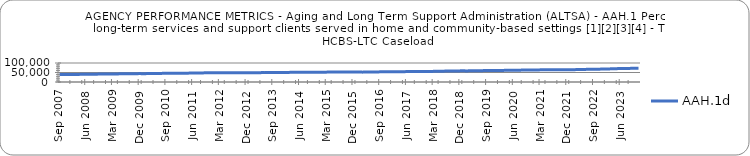
| Category | AAH.1d |
|---|---|
| 0.78378 | 38905 |
| 0.78567 | 39202 |
| 0.78719 | 39279 |
| 0.7887 | 39374 |
| 0.79022 | 39554 |
| 0.79129 | 39686 |
| 0.79193 | 40013 |
| 0.79455 | 40152 |
| 0.79439 | 40320 |
| 0.79457 | 40334 |
| 0.79632 | 40580 |
| 0.79721 | 40848 |
| 0.79865 | 41060 |
| 0.79917 | 41489 |
| 0.79965 | 41567 |
| 0.79991 | 41697 |
| 0.80036 | 41696 |
| 0.80119 | 41884 |
| 0.80135 | 42312 |
| 0.80196 | 42527 |
| 0.80282 | 42767 |
| 0.80375 | 42926 |
| 0.80441 | 43175 |
| 0.80454 | 43436 |
| 0.80574 | 43646 |
| 0.80717 | 43920 |
| 0.80907 | 43999 |
| 0.80996 | 44103 |
| 0.81048 | 43999 |
| 0.81132 | 43990 |
| 0.81235 | 44361 |
| 0.81422 | 44488 |
| 0.81521 | 44777 |
| 0.81511 | 45038 |
| 0.816 | 45290 |
| 0.81562 | 45478 |
| 0.8177 | 45665 |
| 0.81902 | 45926 |
| 0.81999 | 45857 |
| 0.8202 | 45906 |
| 0.82092 | 45936 |
| 0.82336 | 45761 |
| 0.82379 | 46341 |
| 0.82545 | 46554 |
| 0.82578 | 46824 |
| 0.82632 | 46897 |
| 0.82543 | 47022 |
| 0.82484 | 47576 |
| 0.82636 | 47698 |
| 0.82733 | 48230 |
| 0.82838 | 48206 |
| 0.82888 | 48496 |
| 0.82809 | 48030 |
| 0.82917 | 48009 |
| 0.82866 | 48387 |
| 0.82858 | 48517 |
| 0.82802 | 48705 |
| 0.82938 | 48796 |
| 0.83046 | 48743 |
| 0.83086 | 49003 |
| 0.83171 | 48806 |
| 0.83162 | 49080 |
| 0.83156 | 48933 |
| 0.8309 | 48965 |
| 0.83222 | 49088 |
| 0.83276 | 48876 |
| 0.83338 | 49037 |
| 0.83336 | 49130 |
| 0.83239 | 49349 |
| 0.83251 | 49324 |
| 0.8337 | 49890 |
| 0.83426 | 50054 |
| 0.83557 | 50093 |
| 0.83627 | 50323 |
| 0.83614 | 50320 |
| 0.83597 | 50361 |
| 0.83796 | 50494 |
| 0.83821 | 50364 |
| 0.83855 | 50990 |
| 0.84014 | 50725 |
| 0.83995 | 50857 |
| 0.84007 | 50840 |
| 0.8402 | 50993 |
| 0.841 | 51003 |
| 0.8424 | 51217 |
| 0.8431 | 51577 |
| 0.8435 | 51488 |
| 0.8439 | 51702 |
| 0.84383 | 51552 |
| 0.84463 | 51507 |
| 0.84443 | 51964 |
| 0.84487 | 52316 |
| 0.84543 | 52432 |
| 0.8466 | 52539 |
| 0.84682 | 52416 |
| 0.84816 | 52611 |
| 0.84589 | 52605 |
| 0.84646 | 52975 |
| 0.84772 | 52968 |
| 0.8486 | 53045 |
| 0.84786 | 52810 |
| 0.84849 | 53111 |
| 0.84851 | 51918 |
| 0.8492 | 52131 |
| 0.84852 | 52368 |
| 0.84989 | 52681 |
| 0.85076 | 52711 |
| 0.85196 | 53086 |
| 0.8534 | 53369 |
| 0.85355 | 53588 |
| 0.85326 | 53688 |
| 0.85294 | 53717 |
| 0.85119 | 53672 |
| 0.85152 | 53651 |
| 0.85143 | 54213 |
| 0.85182 | 54301 |
| 0.8521 | 54496 |
| 0.85264 | 54690 |
| 0.85441 | 54625 |
| 0.85526 | 54998 |
| 0.85728 | 55029 |
| 0.8577 | 55310 |
| 0.85845 | 55415 |
| 0.85828 | 55412 |
| 0.85799 | 55521 |
| 0.85772 | 55542 |
| 0.85887 | 56020 |
| 0.86116 | 56120 |
| 0.86123 | 56701 |
| 0.86193 | 56791 |
| 0.86372 | 57454 |
| 0.86147 | 57816 |
| 0.86303 | 57645 |
| 0.86431 | 58323 |
| 0.86533 | 58188 |
| 0.86473 | 58595 |
| 0.86411 | 59134 |
| 0.86504 | 58182 |
| 0.86518 | 58764 |
| 0.86641 | 59084 |
| 0.86717 | 59437 |
| 0.86792 | 59359 |
| 0.8694 | 59671 |
| 0.86921 | 59964 |
| 0.87375 | 60080 |
| 0.87927 | 60605 |
| 0.88196 | 60311 |
| 0.8826 | 60527 |
| 0.88378 | 60561 |
| 0.88511 | 60674 |
| 0.8857 | 61407 |
| 0.88923 | 61781 |
| 0.89424 | 61986 |
| 0.89466 | 62341 |
| 0.89512 | 62330 |
| 0.89475 | 62416 |
| 0.89525 | 62608 |
| 0.89485 | 62926 |
| 0.89346 | 62895 |
| 0.89386 | 63162 |
| 0.89048 | 62926 |
| 0.89013 | 63194 |
| 0.89185 | 64019 |
| 0.8934 | 64081 |
| 0.89298 | 64111 |
| 0.89372 | 64542 |
| 0.89661 | 64399 |
| 0.89824 | 64412 |
| 0.89708 | 64372 |
| 0.89662 | 64441 |
| 0.89759 | 64179 |
| 0.89814 | 64224 |
| 0.89823 | 64112 |
| 0.89819 | 64481 |
| 0.89789 | 65276 |
| 0.89829 | 65682 |
| 0.89874 | 66063 |
| 0.90061 | 66378 |
| 0.90125 | 66575 |
| 0.90115 | 67067 |
| 0.90196 | 67190 |
| 0.90133 | 67488 |
| 0.90135 | 67691 |
| 0.90118 | 68130 |
| 0.90219 | 68441 |
| 0.90296 | 68606 |
| 0.90356 | 69757 |
| 0.90607 | 69755 |
| 0.90755 | 70466 |
| 0.91023 | 70584 |
| nan | 70787 |
| nan | 71430 |
| nan | 71533 |
| nan | 72354 |
| nan | 72387 |
| nan | 72452 |